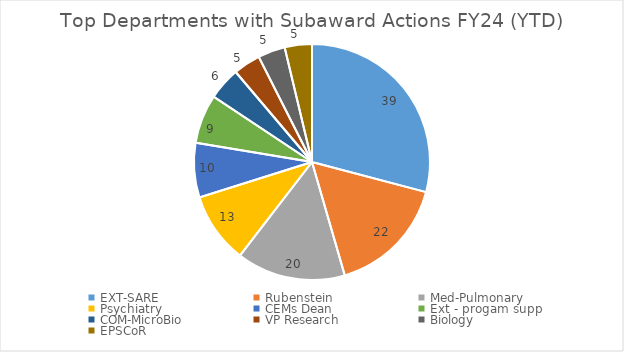
| Category | Total |
|---|---|
| EXT-SARE | 39 |
| Rubenstein | 22 |
| Med-Pulmonary | 20 |
| Psychiatry | 13 |
| CEMs Dean | 10 |
| Ext - progam supp | 9 |
| COM-MicroBio | 6 |
| VP Research | 5 |
| Biology | 5 |
| EPSCoR | 5 |